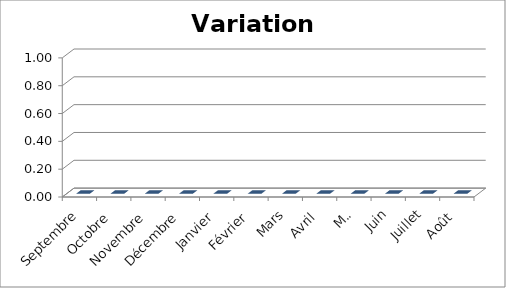
| Category | Series 0 |
|---|---|
| Septembre | 0 |
| Octobre | 0 |
| Novembre | 0 |
| Décembre | 0 |
| Janvier | 0 |
| Février | 0 |
| Mars | 0 |
| Avril | 0 |
| Mai | 0 |
| Juin | 0 |
| Juillet | 0 |
| Août | 0 |